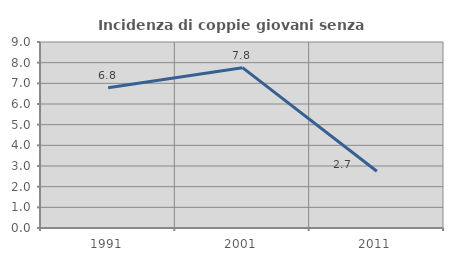
| Category | Incidenza di coppie giovani senza figli |
|---|---|
| 1991.0 | 6.784 |
| 2001.0 | 7.759 |
| 2011.0 | 2.745 |